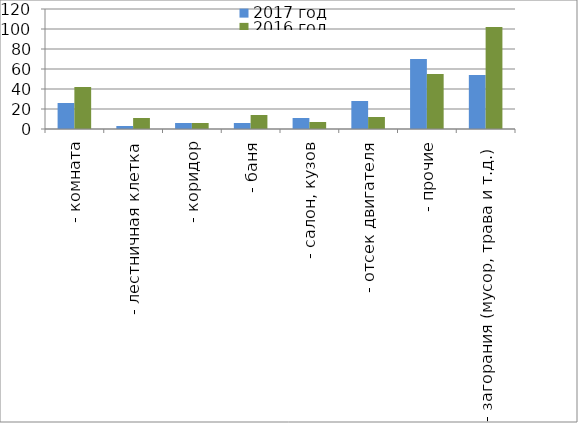
| Category | 2017 год | 2016 год |
|---|---|---|
|  - комната | 26 | 42 |
|  - лестничная клетка | 3 | 11 |
|  - коридор | 6 | 6 |
|  - баня | 6 | 14 |
|  - салон, кузов | 11 | 7 |
|  - отсек двигателя | 28 | 12 |
| - прочие | 70 | 55 |
| - загорания (мусор, трава и т.д.)  | 54 | 102 |